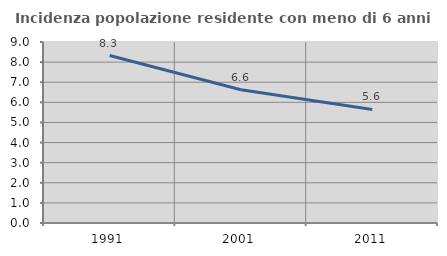
| Category | Incidenza popolazione residente con meno di 6 anni |
|---|---|
| 1991.0 | 8.328 |
| 2001.0 | 6.627 |
| 2011.0 | 5.646 |